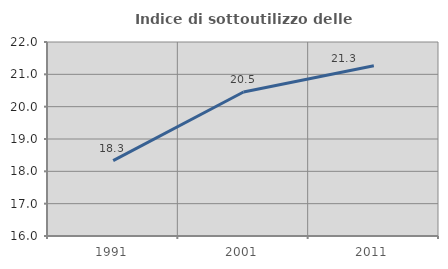
| Category | Indice di sottoutilizzo delle abitazioni  |
|---|---|
| 1991.0 | 18.333 |
| 2001.0 | 20.455 |
| 2011.0 | 21.267 |